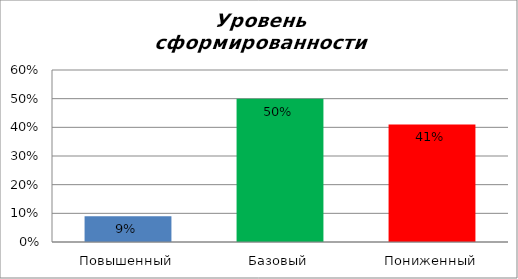
| Category | Уровень сформированности предметных результатов |
|---|---|
| Повышенный | 0.09 |
| Базовый | 0.5 |
| Пониженный | 0.41 |